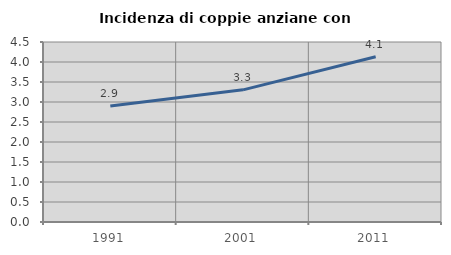
| Category | Incidenza di coppie anziane con figli |
|---|---|
| 1991.0 | 2.9 |
| 2001.0 | 3.304 |
| 2011.0 | 4.131 |